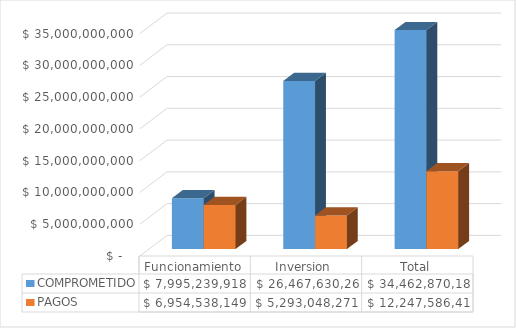
| Category | COMPROMETIDO | PAGOS |
|---|---|---|
| Funcionamiento | 7995239917.52 | 6954538148.52 |
| Inversion  | 26467630265.66 | 5293048270.58 |
| Total | 34462870183.18 | 12247586419.1 |